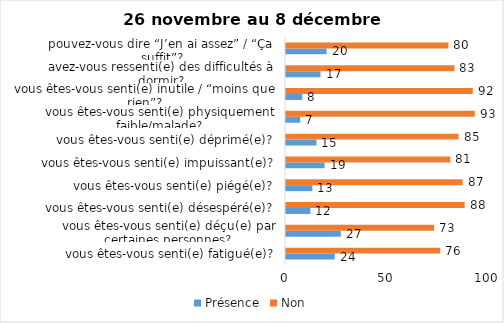
| Category | Présence | Non |
|---|---|---|
| vous êtes-vous senti(e) fatigué(e)? | 24 | 76 |
| vous êtes-vous senti(e) déçu(e) par certaines personnes? | 27 | 73 |
| vous êtes-vous senti(e) désespéré(e)? | 12 | 88 |
| vous êtes-vous senti(e) piégé(e)? | 13 | 87 |
| vous êtes-vous senti(e) impuissant(e)? | 19 | 81 |
| vous êtes-vous senti(e) déprimé(e)? | 15 | 85 |
| vous êtes-vous senti(e) physiquement faible/malade? | 7 | 93 |
| vous êtes-vous senti(e) inutile / “moins que rien”? | 8 | 92 |
| avez-vous ressenti(e) des difficultés à dormir? | 17 | 83 |
| pouvez-vous dire “J’en ai assez” / “Ça suffit”? | 20 | 80 |